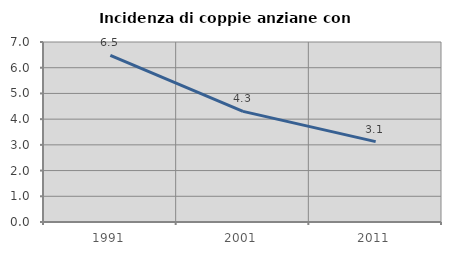
| Category | Incidenza di coppie anziane con figli |
|---|---|
| 1991.0 | 6.481 |
| 2001.0 | 4.301 |
| 2011.0 | 3.125 |